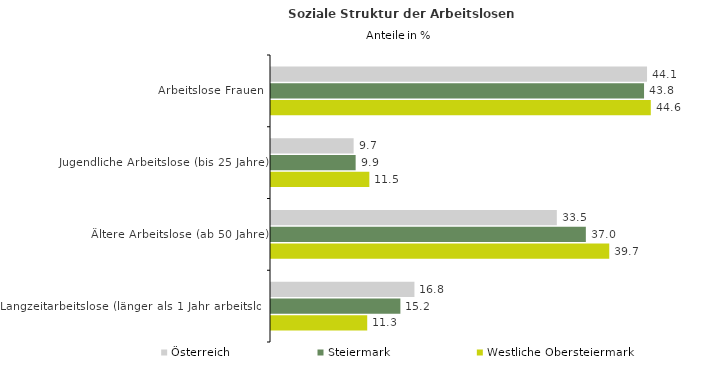
| Category | Österreich | Steiermark | Westliche Obersteiermark |
|---|---|---|---|
| Arbeitslose Frauen | 44.136 | 43.785 | 44.577 |
| Jugendliche Arbeitslose (bis 25 Jahre) | 9.698 | 9.935 | 11.542 |
| Ältere Arbeitslose (ab 50 Jahre) | 33.548 | 36.954 | 39.701 |
| Langzeitarbeitslose (länger als 1 Jahr arbeitslos) | 16.836 | 15.186 | 11.294 |